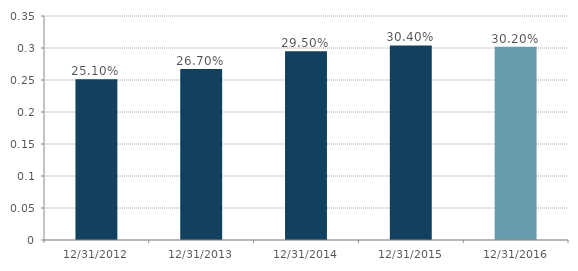
| Category | Series 0 |
|---|---|
| 12/31/12 | 0.251 |
| 12/31/13 | 0.267 |
| 12/31/14 | 0.295 |
| 12/31/15 | 0.304 |
| 12/31/16 | 0.302 |